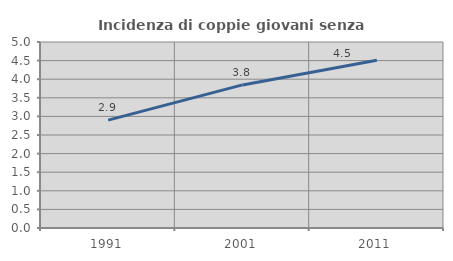
| Category | Incidenza di coppie giovani senza figli |
|---|---|
| 1991.0 | 2.899 |
| 2001.0 | 3.846 |
| 2011.0 | 4.507 |